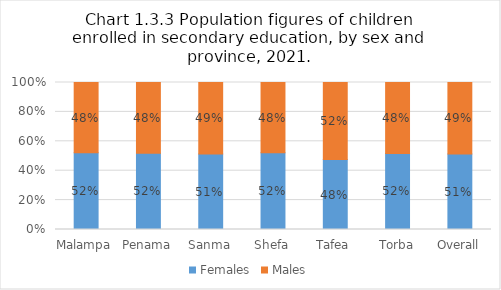
| Category | Females | Males |
|---|---|---|
| Malampa | 0.522 | 0.478 |
| Penama | 0.518 | 0.482 |
| Sanma | 0.513 | 0.487 |
| Shefa | 0.522 | 0.478 |
| Tafea | 0.476 | 0.524 |
| Torba | 0.517 | 0.483 |
| Overall | 0.513 | 0.487 |